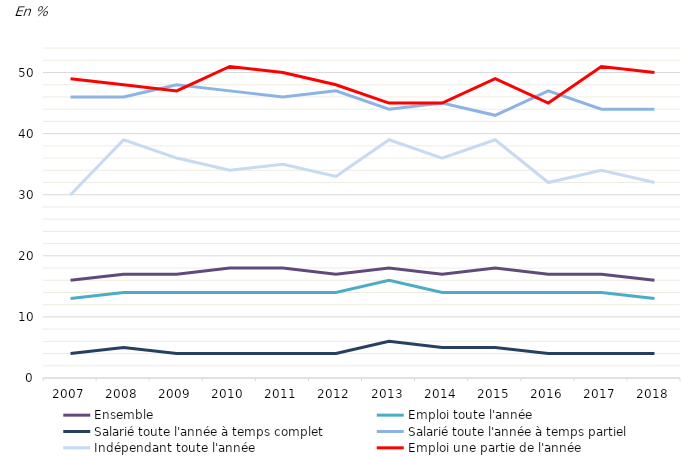
| Category | Ensemble | Emploi toute l'année | Salarié toute l'année à temps complet | Salarié toute l'année à temps partiel | Indépendant toute l'année | Emploi une partie de l'année |
|---|---|---|---|---|---|---|
| 2007 | 16 | 13 | 4 | 46 | 30 | 49 |
| 2008 | 17 | 14 | 5 | 46 | 39 | 48 |
| 2009 | 17 | 14 | 4 | 48 | 36 | 47 |
| 2010 | 18 | 14 | 4 | 47 | 34 | 51 |
| 2011 | 18 | 14 | 4 | 46 | 35 | 50 |
| 2012 | 17 | 14 | 4 | 47 | 33 | 48 |
| 2013 | 18 | 16 | 6 | 44 | 39 | 45 |
| 2014 | 17 | 14 | 5 | 45 | 36 | 45 |
| 2015 | 18 | 14 | 5 | 43 | 39 | 49 |
| 2016 | 17 | 14 | 4 | 47 | 32 | 45 |
| 2017 | 17 | 14 | 4 | 44 | 34 | 51 |
| 2018 | 16 | 13 | 4 | 44 | 32 | 50 |